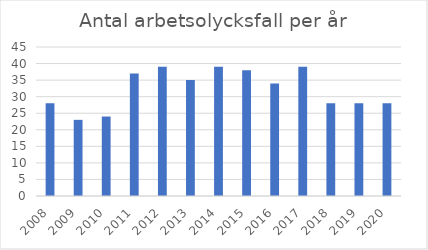
| Category | Antal arbetsolycksfall |
|---|---|
| 2008.0 | 28 |
| 2009.0 | 23 |
| 2010.0 | 24 |
| 2011.0 | 37 |
| 2012.0 | 39 |
| 2013.0 | 35 |
| 2014.0 | 39 |
| 2015.0 | 38 |
| 2016.0 | 34 |
| 2017.0 | 39 |
| 2018.0 | 28 |
| 2019.0 | 28 |
| 2020.0 | 28 |